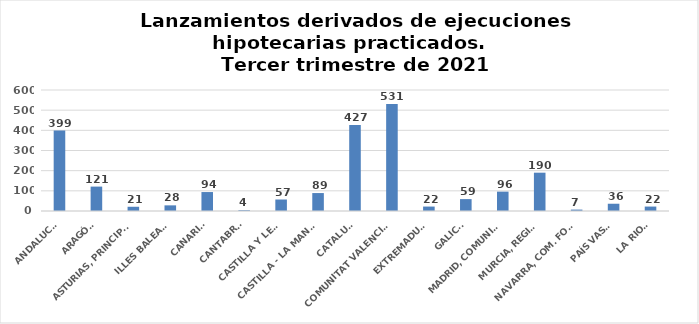
| Category | Series 0 |
|---|---|
| ANDALUCÍA | 399 |
| ARAGÓN | 121 |
| ASTURIAS, PRINCIPADO | 21 |
| ILLES BALEARS | 28 |
| CANARIAS | 94 |
| CANTABRIA | 4 |
| CASTILLA Y LEÓN | 57 |
| CASTILLA - LA MANCHA | 89 |
| CATALUÑA | 427 |
| COMUNITAT VALENCIANA | 531 |
| EXTREMADURA | 22 |
| GALICIA | 59 |
| MADRID, COMUNIDAD | 96 |
| MURCIA, REGIÓN | 190 |
| NAVARRA, COM. FORAL | 7 |
| PAÍS VASCO | 36 |
| LA RIOJA | 22 |